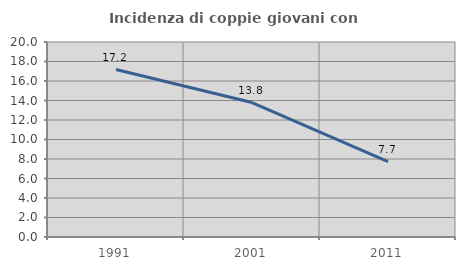
| Category | Incidenza di coppie giovani con figli |
|---|---|
| 1991.0 | 17.179 |
| 2001.0 | 13.792 |
| 2011.0 | 7.734 |